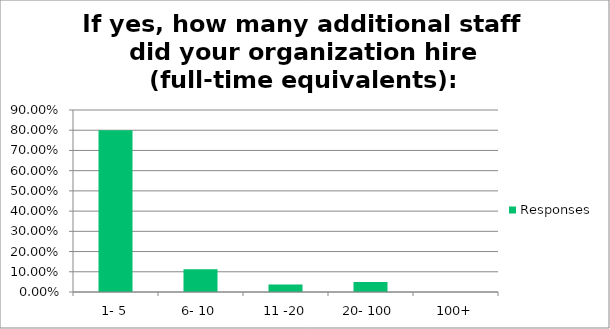
| Category | Responses |
|---|---|
| 1- 5 | 0.8 |
| 6- 10 | 0.112 |
| 11 -20 | 0.038 |
| 20- 100 | 0.05 |
| 100+ | 0 |